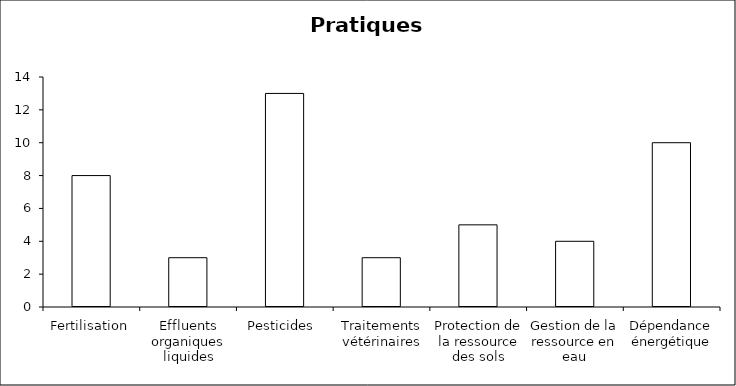
| Category | Series 0 | Series 1 |
|---|---|---|
| Fertilisation | 0 | 8 |
| Effluents organiques liquides | 0 | 3 |
| Pesticides  | 0 | 13 |
| Traitements vétérinaires | 0 | 3 |
| Protection de la ressource des sols | 0 | 5 |
| Gestion de la ressource en eau | 0 | 4 |
| Dépendance énergétique | 0 | 10 |